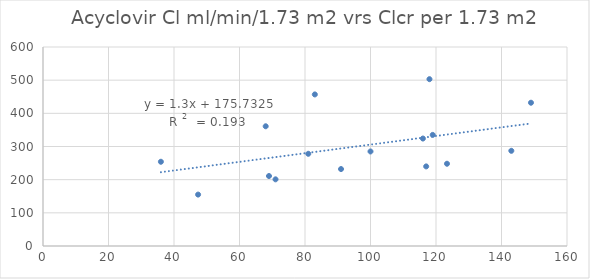
| Category | Series 0 |
|---|---|
| 83.0 | 457 |
| 81.0 | 278 |
| 36.0 | 254 |
| 100.0 | 285 |
| 143.0 | 287 |
| 91.0 | 232 |
| 117.0 | 240 |
| 118.0 | 503 |
| 119.0 | 335 |
| 149.0 | 432 |
| 68.0 | 361 |
| 71.0 | 201 |
| 123.35721252852899 | 248 |
| 47.355345873071066 | 155 |
| 69.0 | 211 |
| 116.0 | 324 |